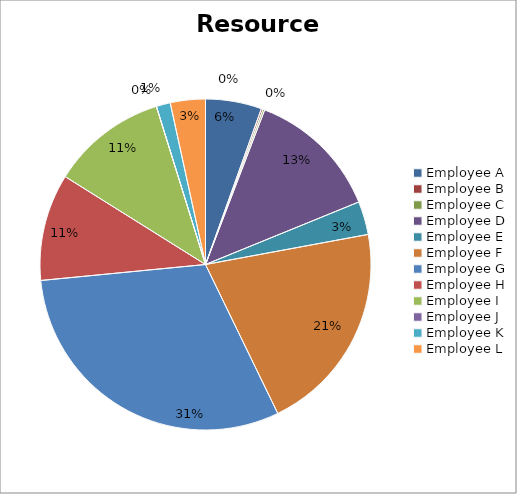
| Category | data |
|---|---|
| Employee A | 2400 |
| Employee B | 75 |
| Employee C | 75 |
| Employee D | 5700 |
| Employee E | 1425 |
| Employee F | 9075 |
| Employee G | 13425 |
| Employee H | 4575 |
| Employee I | 4950 |
| Employee J | 0 |
| Employee K | 600 |
| Employee L | 1500 |